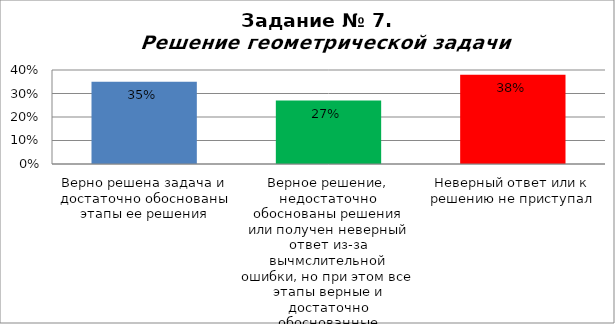
| Category | Решение геометрической задачи  |
|---|---|
| Верно решена задача и достаточно обоснованы этапы ее решения | 0.35 |
| Верное решение, недостаточно обоснованы решения или получен неверный ответ из-за вычмслительной ошибки, но при этом все этапы верные и достаточно обоснованные | 0.27 |
| Неверный ответ или к решению не приступал | 0.38 |